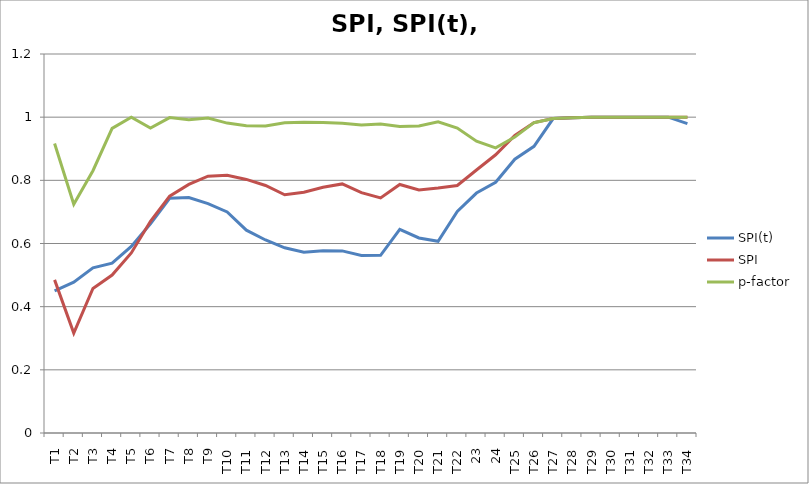
| Category | SPI(t) | SPI | p-factor |
|---|---|---|---|
| T1 | 0.45 | 0.485 | 0.917 |
| T2 | 0.478 | 0.316 | 0.724 |
| T3 | 0.523 | 0.458 | 0.831 |
| T4 | 0.538 | 0.5 | 0.964 |
| T5 | 0.591 | 0.57 | 1 |
| T6 | 0.662 | 0.67 | 0.965 |
| T7 | 0.743 | 0.75 | 0.999 |
| T8 | 0.746 | 0.787 | 0.992 |
| T9 | 0.726 | 0.813 | 0.997 |
| T10 | 0.7 | 0.816 | 0.981 |
| T11 | 0.642 | 0.803 | 0.973 |
| T12 | 0.611 | 0.784 | 0.972 |
| T13 | 0.586 | 0.754 | 0.982 |
| T14 | 0.573 | 0.762 | 0.984 |
| T15 | 0.577 | 0.778 | 0.983 |
| T16 | 0.577 | 0.789 | 0.981 |
| T17 | 0.562 | 0.761 | 0.975 |
| T18 | 0.562 | 0.744 | 0.978 |
| T19 | 0.645 | 0.787 | 0.97 |
| T20 | 0.618 | 0.77 | 0.972 |
| T21 | 0.607 | 0.776 | 0.985 |
| T22 | 0.702 | 0.784 | 0.966 |
| 23 | 0.76 | 0.833 | 0.924 |
| 24 | 0.794 | 0.881 | 0.903 |
| T25 | 0.867 | 0.942 | 0.937 |
| T26 | 0.908 | 0.983 | 0.983 |
| T27 | 0.996 | 0.996 | 0.996 |
| T28 | 0.998 | 0.998 | 0.998 |
| T29 | 1 | 1 | 1 |
| T30 | 1 | 1 | 1 |
| T31 | 1 | 1 | 1 |
| T32 | 1 | 1 | 1 |
| T33 | 1 | 1 | 1 |
| T34 | 0.98 | 1 | 1 |